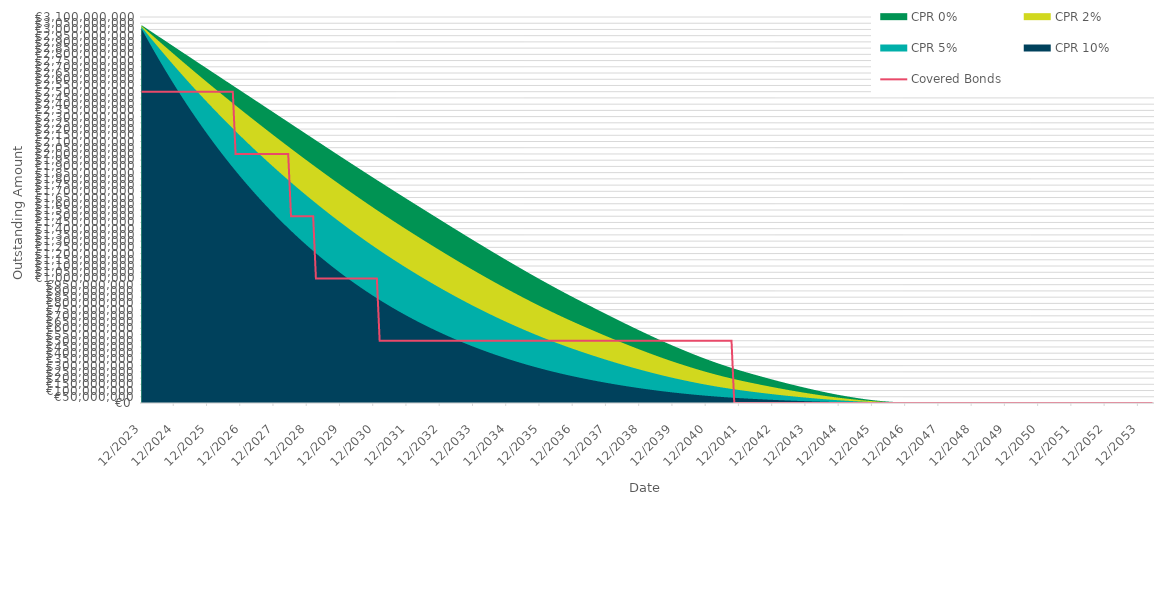
| Category | Covered Bonds |
|---|---|
| 2023-12-31 | 2500000000 |
| 2024-01-31 | 2500000000 |
| 2024-02-29 | 2500000000 |
| 2024-03-31 | 2500000000 |
| 2024-04-30 | 2500000000 |
| 2024-05-31 | 2500000000 |
| 2024-06-30 | 2500000000 |
| 2024-07-31 | 2500000000 |
| 2024-08-31 | 2500000000 |
| 2024-09-30 | 2500000000 |
| 2024-10-31 | 2500000000 |
| 2024-11-30 | 2500000000 |
| 2024-12-31 | 2500000000 |
| 2025-01-31 | 2500000000 |
| 2025-02-28 | 2500000000 |
| 2025-03-31 | 2500000000 |
| 2025-04-30 | 2500000000 |
| 2025-05-31 | 2500000000 |
| 2025-06-30 | 2500000000 |
| 2025-07-31 | 2500000000 |
| 2025-08-31 | 2500000000 |
| 2025-09-30 | 2500000000 |
| 2025-10-31 | 2500000000 |
| 2025-11-30 | 2500000000 |
| 2025-12-31 | 2500000000 |
| 2026-01-31 | 2500000000 |
| 2026-02-28 | 2500000000 |
| 2026-03-31 | 2500000000 |
| 2026-04-30 | 2500000000 |
| 2026-05-31 | 2500000000 |
| 2026-06-30 | 2500000000 |
| 2026-07-31 | 2500000000 |
| 2026-08-31 | 2500000000 |
| 2026-09-30 | 2500000000 |
| 2026-10-31 | 2000000000 |
| 2026-11-30 | 2000000000 |
| 2026-12-31 | 2000000000 |
| 2027-01-31 | 2000000000 |
| 2027-02-28 | 2000000000 |
| 2027-03-31 | 2000000000 |
| 2027-04-30 | 2000000000 |
| 2027-05-31 | 2000000000 |
| 2027-06-30 | 2000000000 |
| 2027-07-31 | 2000000000 |
| 2027-08-31 | 2000000000 |
| 2027-09-30 | 2000000000 |
| 2027-10-31 | 2000000000 |
| 2027-11-30 | 2000000000 |
| 2027-12-31 | 2000000000 |
| 2028-01-31 | 2000000000 |
| 2028-02-29 | 2000000000 |
| 2028-03-31 | 2000000000 |
| 2028-04-30 | 2000000000 |
| 2028-05-31 | 2000000000 |
| 2028-06-30 | 1500000000 |
| 2028-07-31 | 1500000000 |
| 2028-08-31 | 1500000000 |
| 2028-09-30 | 1500000000 |
| 2028-10-31 | 1500000000 |
| 2028-11-30 | 1500000000 |
| 2028-12-31 | 1500000000 |
| 2029-01-31 | 1500000000 |
| 2029-02-28 | 1500000000 |
| 2029-03-31 | 1000000000 |
| 2029-04-30 | 1000000000 |
| 2029-05-31 | 1000000000 |
| 2029-06-30 | 1000000000 |
| 2029-07-31 | 1000000000 |
| 2029-08-31 | 1000000000 |
| 2029-09-30 | 1000000000 |
| 2029-10-31 | 1000000000 |
| 2029-11-30 | 1000000000 |
| 2029-12-31 | 1000000000 |
| 2030-01-31 | 1000000000 |
| 2030-02-28 | 1000000000 |
| 2030-03-31 | 1000000000 |
| 2030-04-30 | 1000000000 |
| 2030-05-31 | 1000000000 |
| 2030-06-30 | 1000000000 |
| 2030-07-31 | 1000000000 |
| 2030-08-31 | 1000000000 |
| 2030-09-30 | 1000000000 |
| 2030-10-31 | 1000000000 |
| 2030-11-30 | 1000000000 |
| 2030-12-31 | 1000000000 |
| 2031-01-31 | 1000000000 |
| 2031-02-28 | 500000000 |
| 2031-03-31 | 500000000 |
| 2031-04-30 | 500000000 |
| 2031-05-31 | 500000000 |
| 2031-06-30 | 500000000 |
| 2031-07-31 | 500000000 |
| 2031-08-31 | 500000000 |
| 2031-09-30 | 500000000 |
| 2031-10-31 | 500000000 |
| 2031-11-30 | 500000000 |
| 2031-12-31 | 500000000 |
| 2032-01-31 | 500000000 |
| 2032-02-29 | 500000000 |
| 2032-03-31 | 500000000 |
| 2032-04-30 | 500000000 |
| 2032-05-31 | 500000000 |
| 2032-06-30 | 500000000 |
| 2032-07-31 | 500000000 |
| 2032-08-31 | 500000000 |
| 2032-09-30 | 500000000 |
| 2032-10-31 | 500000000 |
| 2032-11-30 | 500000000 |
| 2032-12-31 | 500000000 |
| 2033-01-31 | 500000000 |
| 2033-02-28 | 500000000 |
| 2033-03-31 | 500000000 |
| 2033-04-30 | 500000000 |
| 2033-05-31 | 500000000 |
| 2033-06-30 | 500000000 |
| 2033-07-31 | 500000000 |
| 2033-08-31 | 500000000 |
| 2033-09-30 | 500000000 |
| 2033-10-31 | 500000000 |
| 2033-11-30 | 500000000 |
| 2033-12-31 | 500000000 |
| 2034-01-31 | 500000000 |
| 2034-02-28 | 500000000 |
| 2034-03-31 | 500000000 |
| 2034-04-30 | 500000000 |
| 2034-05-31 | 500000000 |
| 2034-06-30 | 500000000 |
| 2034-07-31 | 500000000 |
| 2034-08-31 | 500000000 |
| 2034-09-30 | 500000000 |
| 2034-10-31 | 500000000 |
| 2034-11-30 | 500000000 |
| 2034-12-31 | 500000000 |
| 2035-01-31 | 500000000 |
| 2035-02-28 | 500000000 |
| 2035-03-31 | 500000000 |
| 2035-04-30 | 500000000 |
| 2035-05-31 | 500000000 |
| 2035-06-30 | 500000000 |
| 2035-07-31 | 500000000 |
| 2035-08-31 | 500000000 |
| 2035-09-30 | 500000000 |
| 2035-10-31 | 500000000 |
| 2035-11-30 | 500000000 |
| 2035-12-31 | 500000000 |
| 2036-01-31 | 500000000 |
| 2036-02-29 | 500000000 |
| 2036-03-31 | 500000000 |
| 2036-04-30 | 500000000 |
| 2036-05-31 | 500000000 |
| 2036-06-30 | 500000000 |
| 2036-07-31 | 500000000 |
| 2036-08-31 | 500000000 |
| 2036-09-30 | 500000000 |
| 2036-10-31 | 500000000 |
| 2036-11-30 | 500000000 |
| 2036-12-31 | 500000000 |
| 2037-01-31 | 500000000 |
| 2037-02-28 | 500000000 |
| 2037-03-31 | 500000000 |
| 2037-04-30 | 500000000 |
| 2037-05-31 | 500000000 |
| 2037-06-30 | 500000000 |
| 2037-07-31 | 500000000 |
| 2037-08-31 | 500000000 |
| 2037-09-30 | 500000000 |
| 2037-10-31 | 500000000 |
| 2037-11-30 | 500000000 |
| 2037-12-31 | 500000000 |
| 2038-01-31 | 500000000 |
| 2038-02-28 | 500000000 |
| 2038-03-31 | 500000000 |
| 2038-04-30 | 500000000 |
| 2038-05-31 | 500000000 |
| 2038-06-30 | 500000000 |
| 2038-07-31 | 500000000 |
| 2038-08-31 | 500000000 |
| 2038-09-30 | 500000000 |
| 2038-10-31 | 500000000 |
| 2038-11-30 | 500000000 |
| 2038-12-31 | 500000000 |
| 2039-01-31 | 500000000 |
| 2039-02-28 | 500000000 |
| 2039-03-31 | 500000000 |
| 2039-04-30 | 500000000 |
| 2039-05-31 | 500000000 |
| 2039-06-30 | 500000000 |
| 2039-07-31 | 500000000 |
| 2039-08-31 | 500000000 |
| 2039-09-30 | 500000000 |
| 2039-10-31 | 500000000 |
| 2039-11-30 | 500000000 |
| 2039-12-31 | 500000000 |
| 2040-01-31 | 500000000 |
| 2040-02-29 | 500000000 |
| 2040-03-31 | 500000000 |
| 2040-04-30 | 500000000 |
| 2040-05-31 | 500000000 |
| 2040-06-30 | 500000000 |
| 2040-07-31 | 500000000 |
| 2040-08-31 | 500000000 |
| 2040-09-30 | 500000000 |
| 2040-10-31 | 500000000 |
| 2040-11-30 | 500000000 |
| 2040-12-31 | 500000000 |
| 2041-01-31 | 500000000 |
| 2041-02-28 | 500000000 |
| 2041-03-31 | 500000000 |
| 2041-04-30 | 500000000 |
| 2041-05-31 | 500000000 |
| 2041-06-30 | 500000000 |
| 2041-07-31 | 500000000 |
| 2041-08-31 | 500000000 |
| 2041-09-30 | 500000000 |
| 2041-10-31 | 0 |
| 2041-11-30 | 0 |
| 2041-12-31 | 0 |
| 2042-01-31 | 0 |
| 2042-02-28 | 0 |
| 2042-03-31 | 0 |
| 2042-04-30 | 0 |
| 2042-05-31 | 0 |
| 2042-06-30 | 0 |
| 2042-07-31 | 0 |
| 2042-08-31 | 0 |
| 2042-09-30 | 0 |
| 2042-10-31 | 0 |
| 2042-11-30 | 0 |
| 2042-12-31 | 0 |
| 2043-01-31 | 0 |
| 2043-02-28 | 0 |
| 2043-03-31 | 0 |
| 2043-04-30 | 0 |
| 2043-05-31 | 0 |
| 2043-06-30 | 0 |
| 2043-07-31 | 0 |
| 2043-08-31 | 0 |
| 2043-09-30 | 0 |
| 2043-10-31 | 0 |
| 2043-11-30 | 0 |
| 2043-12-31 | 0 |
| 2044-01-31 | 0 |
| 2044-02-29 | 0 |
| 2044-03-31 | 0 |
| 2044-04-30 | 0 |
| 2044-05-31 | 0 |
| 2044-06-30 | 0 |
| 2044-07-31 | 0 |
| 2044-08-31 | 0 |
| 2044-09-30 | 0 |
| 2044-10-31 | 0 |
| 2044-11-30 | 0 |
| 2044-12-31 | 0 |
| 2045-01-31 | 0 |
| 2045-02-28 | 0 |
| 2045-03-31 | 0 |
| 2045-04-30 | 0 |
| 2045-05-31 | 0 |
| 2045-06-30 | 0 |
| 2045-07-31 | 0 |
| 2045-08-31 | 0 |
| 2045-09-30 | 0 |
| 2045-10-31 | 0 |
| 2045-11-30 | 0 |
| 2045-12-31 | 0 |
| 2046-01-31 | 0 |
| 2046-02-28 | 0 |
| 2046-03-31 | 0 |
| 2046-04-30 | 0 |
| 2046-05-31 | 0 |
| 2046-06-30 | 0 |
| 2046-07-31 | 0 |
| 2046-08-31 | 0 |
| 2046-09-30 | 0 |
| 2046-10-31 | 0 |
| 2046-11-30 | 0 |
| 2046-12-31 | 0 |
| 2047-01-31 | 0 |
| 2047-02-28 | 0 |
| 2047-03-31 | 0 |
| 2047-04-30 | 0 |
| 2047-05-31 | 0 |
| 2047-06-30 | 0 |
| 2047-07-31 | 0 |
| 2047-08-31 | 0 |
| 2047-09-30 | 0 |
| 2047-10-31 | 0 |
| 2047-11-30 | 0 |
| 2047-12-31 | 0 |
| 2048-01-31 | 0 |
| 2048-02-29 | 0 |
| 2048-03-31 | 0 |
| 2048-04-30 | 0 |
| 2048-05-31 | 0 |
| 2048-06-30 | 0 |
| 2048-07-31 | 0 |
| 2048-08-31 | 0 |
| 2048-09-30 | 0 |
| 2048-10-31 | 0 |
| 2048-11-30 | 0 |
| 2048-12-31 | 0 |
| 2049-01-31 | 0 |
| 2049-02-28 | 0 |
| 2049-03-31 | 0 |
| 2049-04-30 | 0 |
| 2049-05-31 | 0 |
| 2049-06-30 | 0 |
| 2049-07-31 | 0 |
| 2049-08-31 | 0 |
| 2049-09-30 | 0 |
| 2049-10-31 | 0 |
| 2049-11-30 | 0 |
| 2049-12-31 | 0 |
| 2050-01-31 | 0 |
| 2050-02-28 | 0 |
| 2050-03-31 | 0 |
| 2050-04-30 | 0 |
| 2050-05-31 | 0 |
| 2050-06-30 | 0 |
| 2050-07-31 | 0 |
| 2050-08-31 | 0 |
| 2050-09-30 | 0 |
| 2050-10-31 | 0 |
| 2050-11-30 | 0 |
| 2050-12-31 | 0 |
| 2051-01-31 | 0 |
| 2051-02-28 | 0 |
| 2051-03-31 | 0 |
| 2051-04-30 | 0 |
| 2051-05-31 | 0 |
| 2051-06-30 | 0 |
| 2051-07-31 | 0 |
| 2051-08-31 | 0 |
| 2051-09-30 | 0 |
| 2051-10-31 | 0 |
| 2051-11-30 | 0 |
| 2051-12-31 | 0 |
| 2052-01-31 | 0 |
| 2052-02-29 | 0 |
| 2052-03-31 | 0 |
| 2052-04-30 | 0 |
| 2052-05-31 | 0 |
| 2052-06-30 | 0 |
| 2052-07-31 | 0 |
| 2052-08-31 | 0 |
| 2052-09-30 | 0 |
| 2052-10-31 | 0 |
| 2052-11-30 | 0 |
| 2052-12-31 | 0 |
| 2053-01-31 | 0 |
| 2053-02-28 | 0 |
| 2053-03-31 | 0 |
| 2053-04-30 | 0 |
| 2053-05-31 | 0 |
| 2053-06-30 | 0 |
| 2053-07-31 | 0 |
| 2053-08-31 | 0 |
| 2053-09-30 | 0 |
| 2053-10-31 | 0 |
| 2053-11-30 | 0 |
| 2053-12-31 | 0 |
| 2054-01-31 | 0 |
| 2054-02-28 | 0 |
| 2054-03-31 | 0 |
| 2054-04-30 | 0 |
| 2054-05-31 | 0 |